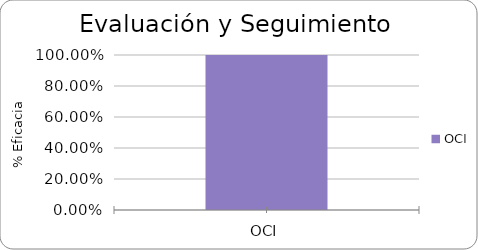
| Category | % Eficacia total |
|---|---|
| OCI | 1 |